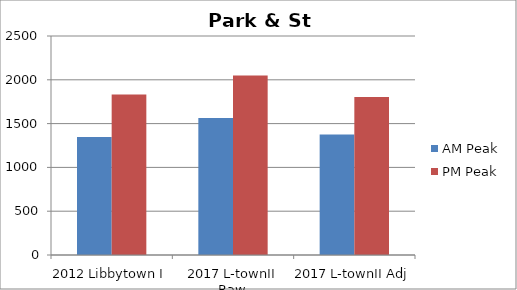
| Category | AM Peak | PM Peak |
|---|---|---|
| 2012 Libbytown I | 1348 | 1832 |
| 2017 L-townII Raw | 1563 | 2048 |
| 2017 L-townII Adj | 1375 | 1803 |